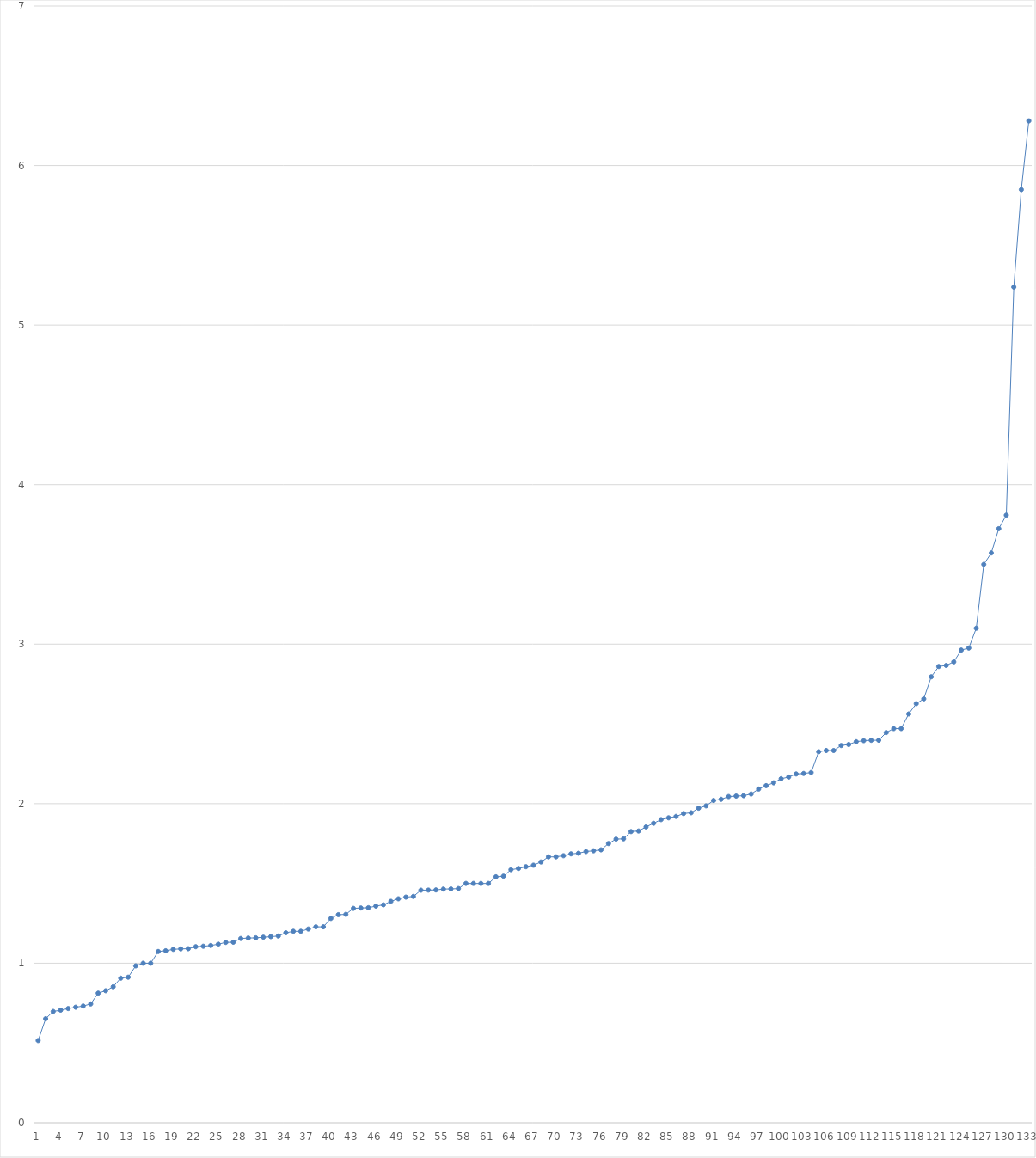
| Category | Series 0 |
|---|---|
| 0 | 0.515 |
| 1 | 0.652 |
| 2 | 0.698 |
| 3 | 0.706 |
| 4 | 0.716 |
| 5 | 0.724 |
| 6 | 0.732 |
| 7 | 0.745 |
| 8 | 0.812 |
| 9 | 0.828 |
| 10 | 0.852 |
| 11 | 0.906 |
| 12 | 0.912 |
| 13 | 0.983 |
| 14 | 1 |
| 15 | 1 |
| 16 | 1.074 |
| 17 | 1.078 |
| 18 | 1.087 |
| 19 | 1.09 |
| 20 | 1.091 |
| 21 | 1.103 |
| 22 | 1.106 |
| 23 | 1.111 |
| 24 | 1.119 |
| 25 | 1.13 |
| 26 | 1.132 |
| 27 | 1.155 |
| 28 | 1.158 |
| 29 | 1.159 |
| 30 | 1.163 |
| 31 | 1.167 |
| 32 | 1.17 |
| 33 | 1.191 |
| 34 | 1.2 |
| 35 | 1.2 |
| 36 | 1.214 |
| 37 | 1.228 |
| 38 | 1.228 |
| 39 | 1.281 |
| 40 | 1.304 |
| 41 | 1.306 |
| 42 | 1.344 |
| 43 | 1.346 |
| 44 | 1.348 |
| 45 | 1.358 |
| 46 | 1.366 |
| 47 | 1.388 |
| 48 | 1.404 |
| 49 | 1.414 |
| 50 | 1.419 |
| 51 | 1.458 |
| 52 | 1.458 |
| 53 | 1.459 |
| 54 | 1.465 |
| 55 | 1.466 |
| 56 | 1.468 |
| 57 | 1.5 |
| 58 | 1.5 |
| 59 | 1.5 |
| 60 | 1.5 |
| 61 | 1.542 |
| 62 | 1.545 |
| 63 | 1.586 |
| 64 | 1.594 |
| 65 | 1.605 |
| 66 | 1.614 |
| 67 | 1.634 |
| 68 | 1.667 |
| 69 | 1.667 |
| 70 | 1.674 |
| 71 | 1.685 |
| 72 | 1.689 |
| 73 | 1.7 |
| 74 | 1.705 |
| 75 | 1.711 |
| 76 | 1.75 |
| 77 | 1.778 |
| 78 | 1.78 |
| 79 | 1.825 |
| 80 | 1.829 |
| 81 | 1.854 |
| 82 | 1.877 |
| 83 | 1.9 |
| 84 | 1.911 |
| 85 | 1.92 |
| 86 | 1.938 |
| 87 | 1.943 |
| 88 | 1.972 |
| 89 | 1.986 |
| 90 | 2.02 |
| 91 | 2.027 |
| 92 | 2.044 |
| 93 | 2.048 |
| 94 | 2.05 |
| 95 | 2.061 |
| 96 | 2.092 |
| 97 | 2.113 |
| 98 | 2.13 |
| 99 | 2.156 |
| 100 | 2.167 |
| 101 | 2.186 |
| 102 | 2.189 |
| 103 | 2.195 |
| 104 | 2.326 |
| 105 | 2.333 |
| 106 | 2.333 |
| 107 | 2.364 |
| 108 | 2.371 |
| 109 | 2.388 |
| 110 | 2.395 |
| 111 | 2.397 |
| 112 | 2.398 |
| 113 | 2.445 |
| 114 | 2.471 |
| 115 | 2.471 |
| 116 | 2.562 |
| 117 | 2.627 |
| 118 | 2.657 |
| 119 | 2.795 |
| 120 | 2.86 |
| 121 | 2.867 |
| 122 | 2.889 |
| 123 | 2.963 |
| 124 | 2.976 |
| 125 | 3.1 |
| 126 | 3.5 |
| 127 | 3.571 |
| 128 | 3.724 |
| 129 | 3.809 |
| 130 | 5.238 |
| 131 | 5.849 |
| 132 | 6.28 |